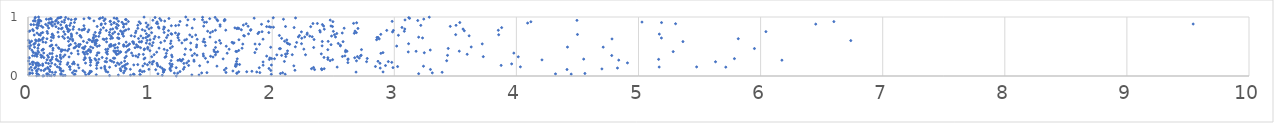
| Category | Series 0 |
|---|---|
| 1.2144086668177836 | 0.001 |
| 0.1215300041497678 | 0.002 |
| 0.12955757611474752 | 0.003 |
| 0.19000727329808487 | 0.004 |
| 0.07145748540343361 | 0.005 |
| 0.1579081799175141 | 0.006 |
| 0.6678965822670203 | 0.007 |
| 0.2871077097609726 | 0.008 |
| 0.17578260060396983 | 0.009 |
| 0.3039889196183683 | 0.01 |
| 1.0997724531098432 | 0.011 |
| 0.2172816240732766 | 0.012 |
| 0.08914720094963424 | 0.013 |
| 0.8394916528208337 | 0.014 |
| 0.7400073868209617 | 0.015 |
| 0.2700880385350502 | 0.016 |
| 1.4009557641455972 | 0.017 |
| 1.3420253837323608 | 0.018 |
| 0.2131027356835072 | 0.019 |
| 0.4727300178710579 | 0.02 |
| 0.5589203119184708 | 0.021 |
| 0.9182514465933596 | 0.022 |
| 0.9173829771784738 | 0.023 |
| 0.3783020428276976 | 0.024 |
| 0.006582157147248693 | 0.025 |
| 0.8694955682985528 | 0.026 |
| 0.08311725168608046 | 0.027 |
| 1.9923875163374185 | 0.028 |
| 0.38530420808940485 | 0.029 |
| 2.106270677933093 | 0.03 |
| 0.8631512541378085 | 0.031 |
| 4.448689318873641 | 0.032 |
| 0.2683881322957727 | 0.033 |
| 0.4965533929733858 | 0.034 |
| 0.15289310293732578 | 0.035 |
| 4.320217744781805 | 0.036 |
| 1.0644931972456235 | 0.037 |
| 0.16207567996610178 | 0.038 |
| 3.19948202993674 | 0.039 |
| 0.27131415560574257 | 0.04 |
| 0.5006649902616074 | 0.041 |
| 2.0673683422281606 | 0.042 |
| 4.561079656690674 | 0.043 |
| 0.07071758758026787 | 0.044 |
| 1.7103522935977045 | 0.045 |
| 0.036442361399267924 | 0.046 |
| 0.018837157007175944 | 0.047 |
| 1.2259524655924003 | 0.048 |
| 1.1991188298199753 | 0.049 |
| 0.012418604002464986 | 0.05 |
| 1.7111607878410697 | 0.051 |
| 1.4223431337241144 | 0.052 |
| 3.311218198336461 | 0.053 |
| 0.7835970894076577 | 0.054 |
| 2.085635196448815 | 0.055 |
| 0.3639291443448661 | 0.056 |
| 1.4655034058711052 | 0.057 |
| 1.8988076638125584 | 0.058 |
| 0.5078086952419605 | 0.059 |
| 1.6216380557405767 | 0.06 |
| 0.4649541261538967 | 0.061 |
| 0.1982417220418609 | 0.062 |
| 3.391782145928223 | 0.063 |
| 0.22514601895393827 | 0.064 |
| 1.1081358974440902 | 0.065 |
| 2.6867241456183755 | 0.066 |
| 0.6541045022682592 | 0.067 |
| 1.8732823697487258 | 0.068 |
| 2.9079057040280025 | 0.069 |
| 1.111623450094454 | 0.07 |
| 1.7261810118645886 | 0.071 |
| 1.791318408692677 | 0.072 |
| 0.9353328085813791 | 0.073 |
| 0.17875863127109448 | 0.074 |
| 1.2448728035505552 | 0.075 |
| 0.5191778176589177 | 0.076 |
| 0.6394770988743578 | 0.077 |
| 0.07226305370325031 | 0.078 |
| 0.9515829772705153 | 0.079 |
| 1.833672253506861 | 0.08 |
| 0.5084172538607648 | 0.081 |
| 0.275686499791003 | 0.082 |
| 0.9145702816420138 | 0.083 |
| 0.39341412404758364 | 0.084 |
| 1.6781800119325332 | 0.085 |
| 0.28782921509224635 | 0.086 |
| 0.7911784298665794 | 0.087 |
| 0.7622995206514396 | 0.088 |
| 0.3789319596568683 | 0.089 |
| 0.45016307857770665 | 0.09 |
| 1.1690072857432736 | 0.091 |
| 1.1115639273219442 | 0.092 |
| 0.12999585442582215 | 0.093 |
| 1.9884748128243175 | 0.094 |
| 0.0700559003311699 | 0.095 |
| 0.10710932790038309 | 0.096 |
| 2.18615909619044 | 0.097 |
| 0.03326343134686315 | 0.098 |
| 0.9192483076067398 | 0.099 |
| 0.7583555995007498 | 0.1 |
| 0.263540297405617 | 0.101 |
| 1.6086274660658695 | 0.102 |
| 0.17698413883345204 | 0.103 |
| 1.1083107982532392 | 0.104 |
| 1.1188556574672994 | 0.105 |
| 2.4064993482573174 | 0.106 |
| 1.045927321486998 | 0.107 |
| 0.6332404251820493 | 0.108 |
| 2.3470736832681944 | 0.109 |
| 4.4145998211966075 | 0.11 |
| 3.2958768766967905 | 0.111 |
| 0.3453876470151424 | 0.112 |
| 0.9902887497298358 | 0.113 |
| 0.8383820959083129 | 0.114 |
| 1.2727948317650122 | 0.115 |
| 1.1629899139518483 | 0.116 |
| 0.00953074659841387 | 0.117 |
| 0.14261472911180018 | 0.118 |
| 0.08561324006316554 | 0.119 |
| 4.700366324342087 | 0.12 |
| 0.8044542824833835 | 0.121 |
| 2.404076960961303 | 0.122 |
| 2.425557911281991 | 0.123 |
| 2.321882044393292 | 0.124 |
| 0.7556920557239851 | 0.125 |
| 0.2670155685261537 | 0.126 |
| 1.9736601300114331 | 0.127 |
| 0.5620886068641742 | 0.128 |
| 0.16442970437099125 | 0.129 |
| 1.099171593054495 | 0.13 |
| 1.622666103192687 | 0.131 |
| 1.163466704324606 | 0.132 |
| 0.05498939959314227 | 0.133 |
| 2.884679531361081 | 0.134 |
| 4.827661643652686 | 0.135 |
| 0.6290112847753035 | 0.136 |
| 0.5987214671053293 | 0.137 |
| 0.41684239468459044 | 0.138 |
| 0.7951683061617838 | 0.139 |
| 1.8941322347570113 | 0.14 |
| 1.2136754111500772 | 0.141 |
| 2.9892559231798543 | 0.142 |
| 0.256668957467506 | 0.143 |
| 0.16085704733452474 | 0.144 |
| 2.3385028590570203 | 0.145 |
| 0.024524616073971755 | 0.146 |
| 1.2805935272024311 | 0.147 |
| 0.06317259403558988 | 0.148 |
| 0.6683096761531312 | 0.149 |
| 5.714982116902153 | 0.15 |
| 2.532072855553639 | 0.151 |
| 5.169354429322742 | 0.152 |
| 1.0832553760394557 | 0.153 |
| 5.476053060237916 | 0.154 |
| 4.032758816817177 | 0.155 |
| 0.33870485329239897 | 0.156 |
| 0.23974740104684847 | 0.157 |
| 0.34430031228826913 | 0.158 |
| 0.772085139470102 | 0.159 |
| 3.0269717343543747 | 0.16 |
| 2.845438578050024 | 0.161 |
| 1.177549545748337 | 0.162 |
| 1.7025082750937164 | 0.163 |
| 0.6283721898968205 | 0.164 |
| 0.18329485083687952 | 0.165 |
| 3.2389846195014504 | 0.166 |
| 1.5474855030833337 | 0.167 |
| 1.6981412365782693 | 0.168 |
| 1.0632274280256655 | 0.169 |
| 0.940816516145423 | 0.17 |
| 1.1706373249566528 | 0.171 |
| 2.1771765790931386 | 0.172 |
| 0.7871203725035805 | 0.173 |
| 1.405815005583368 | 0.174 |
| 0.7193546902782048 | 0.175 |
| 0.08406785991897182 | 0.176 |
| 2.9278704631754104 | 0.177 |
| 0.12007589027417671 | 0.178 |
| 1.3154579294798603 | 0.179 |
| 3.8750276403906248 | 0.18 |
| 0.5623680091954087 | 0.181 |
| 0.5113092561064246 | 0.182 |
| 1.925659709840292 | 0.183 |
| 0.09604633516506478 | 0.184 |
| 0.06981567512083005 | 0.185 |
| 1.993424649986978 | 0.186 |
| 0.4089103243581985 | 0.187 |
| 0.8662845840345009 | 0.188 |
| 1.059758596746602 | 0.189 |
| 0.978612125788084 | 0.19 |
| 0.03855214239562694 | 0.191 |
| 0.7990958561912832 | 0.192 |
| 0.8990297876856288 | 0.193 |
| 0.22255795325921326 | 0.194 |
| 1.7329479270251187 | 0.195 |
| 0.32172261154707815 | 0.196 |
| 0.7468452436221209 | 0.197 |
| 1.7133014876366328 | 0.198 |
| 1.181043078688823 | 0.199 |
| 1.701714797744477 | 0.2 |
| 0.2625010918113093 | 0.201 |
| 1.0174362795477885 | 0.202 |
| 0.12014955565508309 | 0.203 |
| 0.014414819922097796 | 0.204 |
| 3.960983443968994 | 0.205 |
| 0.3645912210511699 | 0.206 |
| 0.3794649746276985 | 0.207 |
| 0.8140643361672617 | 0.208 |
| 0.9564803995310546 | 0.209 |
| 1.1619105715677869 | 0.21 |
| 0.06310473902726861 | 0.211 |
| 0.1683612983943781 | 0.212 |
| 1.276441825274528 | 0.213 |
| 0.08475607923453457 | 0.214 |
| 2.882836006502404 | 0.215 |
| 1.0560193336617936 | 0.216 |
| 0.5650657943237222 | 0.217 |
| 0.19385165117809458 | 0.218 |
| 0.4712647294288405 | 0.219 |
| 0.7330403458825818 | 0.22 |
| 1.299764574469241 | 0.221 |
| 4.909582487966346 | 0.222 |
| 0.0743538105339895 | 0.223 |
| 0.3268972640159609 | 0.224 |
| 0.14801137684104973 | 0.225 |
| 0.763924199655252 | 0.226 |
| 2.619921661947994 | 0.227 |
| 0.03436720885572423 | 0.228 |
| 0.5735472320863995 | 0.229 |
| 0.9955432798756253 | 0.23 |
| 2.9791977332973434 | 0.231 |
| 0.045210557642682565 | 0.232 |
| 0.512599625702839 | 0.233 |
| 0.7027954061152505 | 0.234 |
| 0.03786638561265594 | 0.235 |
| 0.37459857079589015 | 0.236 |
| 1.472308545462176 | 0.237 |
| 1.9254425070657755 | 0.238 |
| 1.0201777620017605 | 0.239 |
| 0.6435827377274184 | 0.24 |
| 5.630816644070149 | 0.241 |
| 0.2665635830499589 | 0.242 |
| 2.7729632537119597 | 0.243 |
| 2.9510421792823607 | 0.244 |
| 0.6318816784771856 | 0.245 |
| 1.7079125578836092 | 0.246 |
| 2.099942120600232 | 0.247 |
| 1.0293207778286724 | 0.248 |
| 2.8666195750080252 | 0.249 |
| 1.3601734545569313 | 0.25 |
| 0.6853419001252932 | 0.251 |
| 0.7913967548888403 | 0.252 |
| 1.3152899265800035 | 0.253 |
| 0.0037035727194608737 | 0.254 |
| 0.24844669395505425 | 0.255 |
| 1.2543624664286686 | 0.256 |
| 2.6902449066783367 | 0.257 |
| 1.2571445150204585 | 0.258 |
| 3.4289475507481417 | 0.259 |
| 2.47479531387841 | 0.26 |
| 1.17163911623469 | 0.261 |
| 0.18369151517990945 | 0.262 |
| 0.18346073529811346 | 0.263 |
| 0.6735107040974481 | 0.264 |
| 1.228316759136871 | 0.265 |
| 0.5161764808138952 | 0.266 |
| 0.5571880633578512 | 0.267 |
| 6.174623689722951 | 0.268 |
| 4.838124578990608 | 0.269 |
| 1.3588804246597852 | 0.27 |
| 0.5105510489168373 | 0.271 |
| 1.2430965223477226 | 0.272 |
| 4.209459235022963 | 0.273 |
| 0.23462062775293158 | 0.274 |
| 0.4585685651109266 | 0.275 |
| 0.15579934313771118 | 0.276 |
| 2.4947101764725113 | 0.277 |
| 1.2432974032861595 | 0.278 |
| 2.6196869374354748 | 0.279 |
| 1.976722433156309 | 0.28 |
| 2.455916632177413 | 0.281 |
| 5.164794351426727 | 0.282 |
| 1.2680992627777723 | 0.283 |
| 0.5806851298246852 | 0.284 |
| 0.23190480774361427 | 0.285 |
| 4.5510528003451345 | 0.286 |
| 0.19593711083526316 | 0.287 |
| 0.9496118843616222 | 0.288 |
| 2.621699753805331 | 0.289 |
| 1.598201856849552 | 0.29 |
| 1.7139719296732154 | 0.291 |
| 0.5484592151065364 | 0.292 |
| 2.018942908008908 | 0.293 |
| 5.785760829999882 | 0.294 |
| 1.9954629027846142 | 0.295 |
| 0.2704840934390322 | 0.296 |
| 2.7782464864701364 | 0.297 |
| 0.6439527417658998 | 0.298 |
| 0.4685625535664691 | 0.299 |
| 1.453178902978486 | 0.3 |
| 0.7101397442114963 | 0.301 |
| 0.6995394337925538 | 0.302 |
| 2.7125562666369505 | 0.303 |
| 0.010003028348418833 | 0.304 |
| 0.9581238310022255 | 0.305 |
| 1.9809235161663068 | 0.306 |
| 0.5059278934539263 | 0.307 |
| 0.7935164315796833 | 0.308 |
| 2.6756133336850443 | 0.309 |
| 2.4558712106466496 | 0.31 |
| 0.008478656930965797 | 0.311 |
| 0.13004204285169615 | 0.312 |
| 0.466498808816066 | 0.313 |
| 0.6075139973434858 | 0.314 |
| 2.424301195984709 | 0.315 |
| 1.12170683443943 | 0.316 |
| 0.10890656040562695 | 0.317 |
| 0.1681880992711305 | 0.318 |
| 0.26501537806043973 | 0.319 |
| 0.20000606577806088 | 0.32 |
| 0.900228087181413 | 0.321 |
| 1.5154665288372773 | 0.322 |
| 0.3365405631894606 | 0.323 |
| 1.1804428412528887 | 0.324 |
| 4.015235943493407 | 0.325 |
| 1.0133209519941768 | 0.326 |
| 0.28965551303354475 | 0.327 |
| 3.7288309465958216 | 0.328 |
| 2.6977724388403717 | 0.329 |
| 2.1114551406531477 | 0.33 |
| 2.5750634680029716 | 0.331 |
| 1.1301499814165066 | 0.332 |
| 0.07293413086293342 | 0.333 |
| 1.4954081151741538 | 0.334 |
| 0.8051665110814061 | 0.335 |
| 0.23505260295395244 | 0.336 |
| 1.9546082636266056 | 0.337 |
| 0.1172548475499714 | 0.338 |
| 1.4371097741236432 | 0.339 |
| 0.8832537460205515 | 0.34 |
| 2.595505940700128 | 0.341 |
| 2.7233666982564406 | 0.342 |
| 0.05447247849822645 | 0.343 |
| 0.03756483919488693 | 0.344 |
| 0.8590375536425104 | 0.345 |
| 1.3446228856910931 | 0.346 |
| 4.7807105248076605 | 0.347 |
| 0.16029547571507446 | 0.348 |
| 2.0770673534907185 | 0.349 |
| 3.435909516403385 | 0.35 |
| 0.5629167574398649 | 0.351 |
| 2.7288306321563205 | 0.352 |
| 1.3840425627249204 | 0.353 |
| 1.1764420137156695 | 0.354 |
| 0.10408716718324941 | 0.355 |
| 0.26493179114915133 | 0.356 |
| 0.30251797585410806 | 0.357 |
| 2.0377947381778414 | 0.358 |
| 1.5352142853422923 | 0.359 |
| 2.2729374263940327 | 0.36 |
| 2.1642455943471726 | 0.361 |
| 1.032999345772811 | 0.362 |
| 0.7268838220414809 | 0.363 |
| 1.2832595663942676 | 0.364 |
| 0.9089562525003161 | 0.365 |
| 0.46530655155491046 | 0.366 |
| 0.9445976034983111 | 0.367 |
| 3.5968442189187826 | 0.368 |
| 0.07655600858272549 | 0.369 |
| 0.06721683321602871 | 0.37 |
| 2.108968996736179 | 0.371 |
| 0.6503869243321991 | 0.372 |
| 0.41134250928176164 | 0.373 |
| 1.435243647208343 | 0.374 |
| 2.4020297839810096 | 0.375 |
| 0.4868428551410285 | 0.376 |
| 0.7247750801707881 | 0.377 |
| 0.7410306452186052 | 0.378 |
| 1.3638709186187286 | 0.379 |
| 0.17942891048942144 | 0.38 |
| 0.19764078753355746 | 0.381 |
| 2.123544055411317 | 0.382 |
| 1.1327790330357383 | 0.383 |
| 2.8900698078016434 | 0.384 |
| 0.3551129743479803 | 0.385 |
| 1.6312280355218902 | 0.386 |
| 0.06369577532228614 | 0.387 |
| 3.9791167802034764 | 0.388 |
| 0.8483866164095889 | 0.389 |
| 0.12895488475870498 | 0.39 |
| 0.5699139440606901 | 0.391 |
| 0.45808242886484446 | 0.392 |
| 0.5809142443769554 | 0.393 |
| 3.245780952231504 | 0.394 |
| 0.045475678886254915 | 0.395 |
| 2.9072246105028148 | 0.396 |
| 1.8581376786821695 | 0.397 |
| 0.6410406247242947 | 0.398 |
| 1.5388012342294677 | 0.399 |
| 0.08783318463266004 | 0.4 |
| 0.7136296656192564 | 0.401 |
| 0.8026703727276432 | 0.402 |
| 0.755790994892924 | 0.403 |
| 1.0540753375954954 | 0.404 |
| 0.4515294536166193 | 0.405 |
| 0.041397626719527465 | 0.406 |
| 0.5117627401882094 | 0.407 |
| 3.1142701651600784 | 0.408 |
| 0.4758153937899154 | 0.409 |
| 0.7590667039904571 | 0.41 |
| 2.6006304174736914 | 0.411 |
| 1.5535268803563154 | 0.412 |
| 5.284117528996314 | 0.413 |
| 1.70989186239571 | 0.414 |
| 1.525889658027383 | 0.415 |
| 0.6498908716464605 | 0.416 |
| 0.272172316187524 | 0.417 |
| 1.7026140481994407 | 0.418 |
| 3.1786082049419626 | 0.419 |
| 2.612730471046257 | 0.42 |
| 3.5321576148751155 | 0.421 |
| 0.7201165400224165 | 0.422 |
| 0.08095922785995896 | 0.423 |
| 0.4082796741672364 | 0.424 |
| 0.7028058358415146 | 0.425 |
| 2.1255413363213873 | 0.426 |
| 0.7377172873414197 | 0.427 |
| 0.32397613257290486 | 0.428 |
| 0.49175554870373434 | 0.429 |
| 0.9984195517671426 | 0.43 |
| 0.5132000749779955 | 0.431 |
| 0.8171708878123009 | 0.432 |
| 1.7256527677427265 | 0.433 |
| 1.1403460379357933 | 0.434 |
| 2.601524316296903 | 0.435 |
| 0.11452453630241753 | 0.436 |
| 0.03195954834145208 | 0.437 |
| 0.20381354403595633 | 0.438 |
| 0.30371384063853796 | 0.439 |
| 3.2945174403650723 | 0.44 |
| 0.28458485229402153 | 0.441 |
| 1.52259641887685 | 0.442 |
| 0.27315957901318166 | 0.443 |
| 1.3325108369778276 | 0.444 |
| 0.9515883835648195 | 0.445 |
| 2.455492093026471 | 0.446 |
| 2.731264316518274 | 0.447 |
| 0.4991929868100742 | 0.448 |
| 0.8281718067770729 | 0.449 |
| 0.6365664820145431 | 0.45 |
| 0.1222296152056328 | 0.451 |
| 0.12602680058503402 | 0.452 |
| 1.115135231518835 | 0.453 |
| 1.6474613540237288 | 0.454 |
| 2.259146701643925 | 0.455 |
| 1.8706065439919954 | 0.456 |
| 0.33522055341513685 | 0.457 |
| 0.6546231806338607 | 0.458 |
| 1.2897226280011587 | 0.459 |
| 0.9540036386791859 | 0.46 |
| 0.9801828100285145 | 0.461 |
| 0.4592929991354948 | 0.462 |
| 2.0592829352645294 | 0.463 |
| 2.0673218664359427 | 0.464 |
| 5.949459672869836 | 0.465 |
| 0.2548248545127168 | 0.466 |
| 3.4416258933617625 | 0.467 |
| 0.014475165464608449 | 0.468 |
| 0.08178506048675574 | 0.469 |
| 0.2050034605905965 | 0.47 |
| 1.7532781421285129 | 0.471 |
| 1.07366097016658 | 0.472 |
| 1.1660646023660548 | 0.473 |
| 0.3767256782516952 | 0.474 |
| 0.712300655247056 | 0.475 |
| 0.44660445058641124 | 0.476 |
| 0.5309918179269145 | 0.477 |
| 0.4555493772488923 | 0.478 |
| 0.9216746581298391 | 0.479 |
| 0.8768575304962707 | 0.48 |
| 0.2482308442613794 | 0.481 |
| 0.7334311909418764 | 0.482 |
| 2.339557318140506 | 0.483 |
| 1.5356967767313097 | 0.484 |
| 0.3860829731606372 | 0.485 |
| 0.9803711453419276 | 0.486 |
| 1.98745916309427 | 0.487 |
| 0.05356973347295536 | 0.488 |
| 4.710806058074795 | 0.489 |
| 4.418313784568203 | 0.49 |
| 1.3798995639929807 | 0.491 |
| 3.6298125130679835 | 0.492 |
| 0.5129685291280872 | 0.493 |
| 0.8951197283275045 | 0.494 |
| 2.189564570981082 | 0.495 |
| 0.41760611924233115 | 0.496 |
| 0.6699927743092529 | 0.497 |
| 1.1826925293829593 | 0.498 |
| 0.9036364402011302 | 0.499 |
| 0.4683249587055913 | 0.5 |
| 0.0039178397142495 | 0.501 |
| 0.5667775159166896 | 0.502 |
| 0.8063840804234985 | 0.503 |
| 0.7844980001204522 | 0.504 |
| 1.6236178933989305 | 0.505 |
| 0.1808701970351314 | 0.506 |
| 3.0195449877864187 | 0.507 |
| 0.3976195077114462 | 0.508 |
| 0.6830543365419403 | 0.509 |
| 2.558430439769287 | 0.51 |
| 2.4088035310345055 | 0.511 |
| 0.1878937368980898 | 0.512 |
| 0.3356699907914724 | 0.513 |
| 0.5840736584150662 | 0.514 |
| 1.4529052308570733 | 0.515 |
| 1.0166057163604636 | 0.516 |
| 0.7019251211390012 | 0.517 |
| 0.022006755875530238 | 0.518 |
| 0.08559235664211284 | 0.519 |
| 0.8199938428598982 | 0.52 |
| 0.6685466650304969 | 0.521 |
| 2.5585579613055325 | 0.522 |
| 0.23116235008207558 | 0.523 |
| 0.7846171062015229 | 0.524 |
| 0.19576918680456848 | 0.525 |
| 1.3816011086939144 | 0.526 |
| 0.7834014999848634 | 0.527 |
| 0.5501600971881404 | 0.528 |
| 0.8882964856452615 | 0.529 |
| 0.7139885844936203 | 0.53 |
| 2.4820671130135397 | 0.531 |
| 0.0892194532306527 | 0.532 |
| 0.4155013421777372 | 0.533 |
| 0.34859132976199286 | 0.534 |
| 0.427502454453328 | 0.535 |
| 0.6789812334470564 | 0.536 |
| 2.143004240702837 | 0.537 |
| 1.8961737972857189 | 0.538 |
| 0.047759660218581614 | 0.539 |
| 0.049911072285701547 | 0.54 |
| 1.7593717915202847 | 0.541 |
| 1.8595472472401933 | 0.542 |
| 0.8313911499571931 | 0.543 |
| 3.7202510745080994 | 0.544 |
| 0.9960463262706293 | 0.545 |
| 2.130070482895544 | 0.546 |
| 3.1171514904778785 | 0.547 |
| 2.240037896859853 | 0.548 |
| 0.8656917896291195 | 0.549 |
| 1.1675235817655005 | 0.55 |
| 0.7451093523239072 | 0.551 |
| 2.5409287786029333 | 0.552 |
| 0.5573791333128929 | 0.553 |
| 0.38683312458144675 | 0.554 |
| 1.680424338355185 | 0.555 |
| 1.5781958073030993 | 0.556 |
| 0.058898253068717904 | 0.557 |
| 1.3325722953569992 | 0.558 |
| 0.9682918976128669 | 0.559 |
| 1.2603657309839489 | 0.56 |
| 0.011899699576260395 | 0.561 |
| 1.6870016685859526 | 0.562 |
| 2.1208863736997685 | 0.563 |
| 0.5469357882657495 | 0.564 |
| 0.4838629645863055 | 0.565 |
| 1.0246591640022924 | 0.566 |
| 1.0874040166157928 | 0.567 |
| 2.20014801941295 | 0.568 |
| 0.14589473486794566 | 0.569 |
| 0.016410021743221988 | 0.57 |
| 1.6713117234885024 | 0.571 |
| 1.5374423283460132 | 0.572 |
| 1.4482132891897672 | 0.573 |
| 0.8037396642590983 | 0.574 |
| 0.8636056549500681 | 0.575 |
| 0.12275645403033227 | 0.576 |
| 0.9277096353992362 | 0.577 |
| 0.6435578792436958 | 0.578 |
| 0.9116871683654304 | 0.579 |
| 0.8567342884697023 | 0.58 |
| 0.5254681108529466 | 0.581 |
| 2.5802492707332885 | 0.582 |
| 5.3640445930416565 | 0.583 |
| 1.434352119713144 | 0.584 |
| 2.410128680425395 | 0.585 |
| 0.9303775910641271 | 0.586 |
| 2.458467845667814 | 0.587 |
| 0.4539161473491719 | 0.588 |
| 0.33167245145945823 | 0.589 |
| 2.101344077608012 | 0.59 |
| 0.029131030199493552 | 0.591 |
| 0.06640226231902557 | 0.592 |
| 1.1715870309093261 | 0.593 |
| 0.5569444548865257 | 0.594 |
| 1.119170604628083 | 0.595 |
| 0.08571887638918232 | 0.596 |
| 0.5253846221166533 | 0.597 |
| 0.36630722299322327 | 0.598 |
| 0.18902161702139963 | 0.599 |
| 6.7387108639583815 | 0.6 |
| 0.5400970095205768 | 0.601 |
| 1.5684905774860316 | 0.602 |
| 0.9759691239912408 | 0.603 |
| 0.003976063292822785 | 0.604 |
| 0.5670212990870018 | 0.605 |
| 0.09880683148969507 | 0.606 |
| 1.2370763903450976 | 0.607 |
| 1.2831625992990976 | 0.608 |
| 0.5587835907821181 | 0.609 |
| 0.5055465217767665 | 0.61 |
| 0.062040151364576315 | 0.611 |
| 2.1193626926339326 | 0.612 |
| 0.9995247054682077 | 0.613 |
| 1.7275920288396756 | 0.614 |
| 2.8551864144329384 | 0.615 |
| 0.4984419609219178 | 0.616 |
| 0.6254906054191376 | 0.617 |
| 2.3427704296941285 | 0.618 |
| 0.08990913299211752 | 0.619 |
| 0.11635350492400959 | 0.62 |
| 1.2986398844972509 | 0.621 |
| 1.3857331736356515 | 0.622 |
| 0.3650245106782263 | 0.623 |
| 1.9249082087234128 | 0.624 |
| 1.441357943662795 | 0.625 |
| 0.6150723778359624 | 0.626 |
| 0.3463257691414831 | 0.627 |
| 4.783013336620924 | 0.628 |
| 2.8765769104086285 | 0.629 |
| 1.0318027814865458 | 0.63 |
| 0.15531625236732063 | 0.631 |
| 5.817145785645564 | 0.632 |
| 0.6429905165183519 | 0.633 |
| 0.6767556021765504 | 0.634 |
| 0.9050664518779596 | 0.635 |
| 0.7455064110150573 | 0.636 |
| 0.2977337784069244 | 0.637 |
| 2.0770246090205915 | 0.638 |
| 0.5354734958217539 | 0.639 |
| 2.242051572825048 | 0.64 |
| 0.7419993540925897 | 0.641 |
| 0.9423642024234957 | 0.642 |
| 0.6921057442467602 | 0.643 |
| 5.187575451501196 | 0.644 |
| 3.2314192824659163 | 0.645 |
| 0.7339984336103502 | 0.646 |
| 0.12490979509248772 | 0.647 |
| 0.2075580200407648 | 0.648 |
| 1.2288331207399998 | 0.649 |
| 0.9649023384122182 | 0.65 |
| 1.1348361389255013 | 0.651 |
| 0.327803822500172 | 0.652 |
| 2.8580096986167636 | 0.653 |
| 2.866965835732398 | 0.654 |
| 0.5365495175644567 | 0.655 |
| 1.0719902443215723 | 0.656 |
| 0.4355574380208716 | 0.657 |
| 3.1995556501628344 | 0.658 |
| 0.19190691233071921 | 0.659 |
| 1.4909509094316988 | 0.66 |
| 2.5186805279806213 | 0.661 |
| 2.266257354051991 | 0.662 |
| 2.2143790726745793 | 0.663 |
| 1.3435372249936062 | 0.664 |
| 2.327590908164059 | 0.665 |
| 0.25198827713580824 | 0.666 |
| 0.3566555077303447 | 0.667 |
| 0.28421861286140837 | 0.668 |
| 1.0407889046374201 | 0.669 |
| 0.9806742855946036 | 0.67 |
| 0.8731293253772532 | 0.671 |
| 0.5797300443848742 | 0.672 |
| 0.5554789006909585 | 0.673 |
| 0.6817282202631039 | 0.674 |
| 0.7823061106105635 | 0.675 |
| 2.307466862095032 | 0.676 |
| 2.486099822163454 | 0.677 |
| 0.9242579375484214 | 0.678 |
| 1.7722503252899424 | 0.679 |
| 0.20864230933465178 | 0.68 |
| 3.6128978210056837 | 0.681 |
| 0.845197005658723 | 0.682 |
| 0.42574448663285497 | 0.683 |
| 0.42661752400830877 | 0.684 |
| 1.766094641422983 | 0.685 |
| 2.2227403502534564 | 0.686 |
| 2.0587577128059906 | 0.687 |
| 0.9906601135688196 | 0.688 |
| 1.2266948660277337 | 0.689 |
| 3.033507138554681 | 0.69 |
| 1.1453023989451017 | 0.691 |
| 0.10009850758444137 | 0.692 |
| 0.3567107802980914 | 0.693 |
| 1.3735716758734964 | 0.694 |
| 0.05102050426002272 | 0.695 |
| 1.3249156203276813 | 0.696 |
| 0.5396061110068443 | 0.697 |
| 0.6670214174474244 | 0.698 |
| 3.8549449181808275 | 0.699 |
| 2.5101214255314073 | 0.7 |
| 3.502678944615633 | 0.701 |
| 0.08886495485939161 | 0.702 |
| 0.19841712605735218 | 0.703 |
| 4.500106087987897 | 0.704 |
| 2.285332122596706 | 0.705 |
| 2.889471559058561 | 0.706 |
| 0.3029251866131122 | 0.707 |
| 1.177247407338943 | 0.708 |
| 0.7725276685270285 | 0.709 |
| 5.170486962833346 | 0.71 |
| 0.1989731995876582 | 0.711 |
| 0.7408075618878659 | 0.712 |
| 0.3539569174494506 | 0.713 |
| 1.8061177939305413 | 0.714 |
| 1.2350663557802515 | 0.715 |
| 0.969802718544799 | 0.716 |
| 1.172019332088936 | 0.717 |
| 0.6940303502429765 | 0.718 |
| 1.8831088101050415 | 0.719 |
| 2.5290011581290566 | 0.72 |
| 0.7761071921795748 | 0.721 |
| 0.16084469972425422 | 0.722 |
| 0.5869749216557493 | 0.723 |
| 2.6724553690500894 | 0.724 |
| 0.10768095934729507 | 0.725 |
| 0.40016921514317777 | 0.726 |
| 2.2871195626484235 | 0.727 |
| 0.07392727722248273 | 0.728 |
| 2.573649780836713 | 0.729 |
| 1.207605773509331 | 0.73 |
| 0.8805475293310814 | 0.731 |
| 0.5881950415233724 | 0.732 |
| 1.4933453087748862 | 0.733 |
| 1.0124376588120998 | 0.734 |
| 2.6892504752974977 | 0.735 |
| 1.9723083623186415 | 0.736 |
| 0.12019687967699287 | 0.737 |
| 1.1151318939430859 | 0.738 |
| 0.5507620536244282 | 0.739 |
| 0.6676727108922623 | 0.74 |
| 1.8916630504340604 | 0.741 |
| 0.24518709528681118 | 0.742 |
| 0.589740348765428 | 0.743 |
| 0.7096742615939162 | 0.744 |
| 0.7717288897026873 | 0.745 |
| 2.3932370380688175 | 0.746 |
| 2.9855121561950373 | 0.747 |
| 2.2393263054294112 | 0.748 |
| 0.4904798352712024 | 0.749 |
| 0.29295237989927997 | 0.75 |
| 1.9169998865191775 | 0.751 |
| 6.043604029754857 | 0.752 |
| 0.33059544423585535 | 0.753 |
| 0.15636015009659351 | 0.754 |
| 1.5125588227102116 | 0.755 |
| 0.008212333572278938 | 0.756 |
| 2.5009652465134513 | 0.757 |
| 3.082108000662938 | 0.758 |
| 1.4712886499645421 | 0.759 |
| 0.3276610705074956 | 0.76 |
| 2.678202800457637 | 0.761 |
| 0.8848870991842562 | 0.762 |
| 0.758280540749823 | 0.763 |
| 0.7886918176479968 | 0.764 |
| 0.016467371186734123 | 0.765 |
| 0.9578170356990404 | 0.766 |
| 3.573433172930647 | 0.767 |
| 0.043769513783312675 | 0.768 |
| 1.1506795227240652 | 0.769 |
| 2.389894067014001 | 0.77 |
| 0.641488712598341 | 0.771 |
| 2.9926398680783444 | 0.772 |
| 2.938081663666908 | 0.773 |
| 1.8223580049086914 | 0.774 |
| 3.8518729720828695 | 0.775 |
| 1.534954516630072 | 0.776 |
| 1.6196188208275326 | 0.777 |
| 0.4405404144540882 | 0.778 |
| 0.3408150838161654 | 0.779 |
| 0.8017601867489222 | 0.78 |
| 0.49859462074754085 | 0.781 |
| 0.44789438552732597 | 0.782 |
| 1.7475415099219311 | 0.783 |
| 0.5955090359099872 | 0.784 |
| 0.9360699209816459 | 0.785 |
| 1.825583465838851 | 0.786 |
| 0.45991225696240123 | 0.787 |
| 0.038201052454462314 | 0.788 |
| 0.6760922127458849 | 0.789 |
| 0.41880447364864754 | 0.79 |
| 0.36890828861993913 | 0.791 |
| 1.1096099699809892 | 0.792 |
| 2.426768760066261 | 0.793 |
| 0.32582620234390985 | 0.794 |
| 0.8240657780810202 | 0.795 |
| 3.5629423407677274 | 0.796 |
| 3.0859249868905763 | 0.797 |
| 0.6944488431688501 | 0.798 |
| 0.9907946793162221 | 0.799 |
| 0.27349274286177216 | 0.8 |
| 0.32352132569924197 | 0.801 |
| 1.710875880119567 | 0.802 |
| 0.4627719011118626 | 0.803 |
| 1.7274814155587543 | 0.804 |
| 0.2510956118048832 | 0.805 |
| 2.70234057345642 | 0.806 |
| 0.7288287194797362 | 0.807 |
| 0.8995212319939444 | 0.808 |
| 0.07611537497466808 | 0.809 |
| 2.5892410997484627 | 0.81 |
| 1.073155860319334 | 0.811 |
| 1.3448649177181187 | 0.812 |
| 0.16877028217092438 | 0.813 |
| 0.2801487409766947 | 0.814 |
| 1.7190393184621193 | 0.815 |
| 1.6946621975775338 | 0.816 |
| 1.0106532491155265 | 0.817 |
| 0.6175853964762369 | 0.818 |
| 0.07212662815186202 | 0.819 |
| 3.8793272726604875 | 0.82 |
| 2.1795346579027095 | 0.821 |
| 1.1175215540577905 | 0.822 |
| 3.06293258275689 | 0.823 |
| 0.3166132025783012 | 0.824 |
| 0.12161509099530372 | 0.825 |
| 0.7218595305734256 | 0.826 |
| 2.0101597678065053 | 0.827 |
| 1.9886975772062387 | 0.828 |
| 1.068330340628734 | 0.829 |
| 0.7825149658686031 | 0.83 |
| 1.1134667038820827 | 0.831 |
| 0.9739328673483012 | 0.832 |
| 0.373619659252052 | 0.833 |
| 1.9757815774020728 | 0.834 |
| 0.22925129325965124 | 0.835 |
| 2.3152634322583046 | 0.836 |
| 1.954651598660908 | 0.837 |
| 2.4940536063841514 | 0.838 |
| 2.109193284565955 | 0.839 |
| 0.5664946491074515 | 0.84 |
| 3.458435452312745 | 0.841 |
| 0.31389124316834965 | 0.842 |
| 1.80268251802506 | 0.843 |
| 1.5735404168987568 | 0.844 |
| 1.4389394664307382 | 0.845 |
| 0.10882824964928485 | 0.846 |
| 2.4209930187553694 | 0.847 |
| 2.4815486815934964 | 0.848 |
| 0.2004201078859333 | 0.849 |
| 0.16011876650660617 | 0.85 |
| 0.08535465010208848 | 0.851 |
| 1.1740808648427488 | 0.852 |
| 0.4579283711857741 | 0.853 |
| 1.2095014807038325 | 0.854 |
| 0.3150167132567462 | 0.855 |
| 0.7397739025138785 | 0.856 |
| 0.34214582678989025 | 0.857 |
| 3.2169803520032763 | 0.858 |
| 3.5055980639248383 | 0.859 |
| 0.8994519736493314 | 0.86 |
| 1.3019120521995557 | 0.861 |
| 1.2345011116326747 | 0.862 |
| 1.763871477104156 | 0.863 |
| 0.9836754553529855 | 0.864 |
| 0.0843362283374751 | 0.865 |
| 0.5987854424847376 | 0.866 |
| 0.2684302682780112 | 0.867 |
| 1.5729608714177352 | 0.868 |
| 0.07057171480915513 | 0.869 |
| 0.046990128930144086 | 0.87 |
| 0.02449778507449886 | 0.871 |
| 2.41097944000633 | 0.872 |
| 0.7836815216065026 | 0.873 |
| 0.6820053653256206 | 0.874 |
| 0.14453583618597457 | 0.875 |
| 1.9125202454842516 | 0.876 |
| 0.18970786825785324 | 0.877 |
| 0.7265137873593831 | 0.878 |
| 6.451546515892722 | 0.879 |
| 0.21820248285451138 | 0.88 |
| 9.542642067180683 | 0.881 |
| 0.7825361902450342 | 0.882 |
| 0.6007391102359237 | 0.883 |
| 0.8042028739601764 | 0.884 |
| 1.7867172211482418 | 0.885 |
| 5.303715521252858 | 0.886 |
| 0.6329663260255676 | 0.887 |
| 1.0618977401279421 | 0.888 |
| 2.3338358850271153 | 0.889 |
| 2.3699416773993933 | 0.89 |
| 0.9207557419832793 | 0.891 |
| 2.666427396279416 | 0.892 |
| 0.08814198703344976 | 0.893 |
| 1.051771070761824 | 0.894 |
| 0.35052713639571603 | 0.895 |
| 0.24496445267286884 | 0.896 |
| 4.091843624651257 | 0.897 |
| 0.16885737071113407 | 0.898 |
| 0.9671087754252778 | 0.899 |
| 0.7030706841540104 | 0.9 |
| 0.17779575873989958 | 0.901 |
| 2.6915697811473565 | 0.902 |
| 0.08102119970129204 | 0.903 |
| 0.7066489748075745 | 0.904 |
| 5.188641158163352 | 0.905 |
| 3.5365385895835266 | 0.906 |
| 0.3806197939389479 | 0.907 |
| 0.24755597790035874 | 0.908 |
| 0.29774768136123353 | 0.909 |
| 1.4443771485846557 | 0.91 |
| 0.7699334163067145 | 0.911 |
| 1.4616755464458 | 0.912 |
| 0.19398456997745564 | 0.913 |
| 5.028513686538819 | 0.914 |
| 0.2009744152106559 | 0.915 |
| 1.0575575551101146 | 0.916 |
| 0.08674660257252069 | 0.917 |
| 0.9101433610443189 | 0.918 |
| 4.1186189740076955 | 0.919 |
| 0.2775190959837266 | 0.92 |
| 2.4971814062467645 | 0.921 |
| 6.6001799187508485 | 0.922 |
| 0.8218573577437671 | 0.923 |
| 0.6721765322915044 | 0.924 |
| 1.245147780627254 | 0.925 |
| 2.982378201803768 | 0.926 |
| 1.9686144155031975 | 0.927 |
| 0.6746219301577147 | 0.928 |
| 0.7405774046937064 | 0.929 |
| 0.2256792729163888 | 0.93 |
| 1.11984179879804 | 0.931 |
| 0.10569187433709701 | 0.932 |
| 0.059750027317101925 | 0.933 |
| 0.5400528435556876 | 0.934 |
| 0.04429169439254826 | 0.935 |
| 1.6074595305672514 | 0.936 |
| 1.5534686421511037 | 0.937 |
| 0.05433332890502997 | 0.938 |
| 0.6227961140931092 | 0.939 |
| 3.191994470548625 | 0.94 |
| 0.0953831592644704 | 0.941 |
| 1.0900958450945408 | 0.942 |
| 4.49598552474763 | 0.943 |
| 0.23205803317913337 | 0.944 |
| 1.0228181260452995 | 0.945 |
| 0.08562146061828044 | 0.946 |
| 2.4752131380894493 | 0.947 |
| 0.299483708107672 | 0.948 |
| 1.6145001158166477 | 0.949 |
| 3.087745630820212 | 0.95 |
| 1.3095045891837431 | 0.951 |
| 1.4292664455856379 | 0.952 |
| 0.09110513188445989 | 0.953 |
| 0.35425797618903926 | 0.954 |
| 0.8045349185422037 | 0.955 |
| 1.5466526218109833 | 0.956 |
| 1.6103065878860214 | 0.957 |
| 0.7987203057899017 | 0.958 |
| 0.3846006661938698 | 0.959 |
| 1.361899292991823 | 0.96 |
| 0.1712096975413673 | 0.961 |
| 2.092132820575291 | 0.962 |
| 0.15050714923686212 | 0.963 |
| 3.241321853081837 | 0.964 |
| 0.6323987645351753 | 0.965 |
| 0.191027529236381 | 0.966 |
| 0.391451962196448 | 0.967 |
| 0.33085123386744086 | 0.968 |
| 0.4581507826920029 | 0.969 |
| 0.7254762425844957 | 0.97 |
| 0.5842435302469897 | 0.971 |
| 1.4881283589157597 | 0.972 |
| 1.0790323988825838 | 0.973 |
| 0.18327001199261436 | 0.974 |
| 1.154098680274751 | 0.975 |
| 0.5058146578004844 | 0.976 |
| 3.1247763840100764 | 0.977 |
| 0.7278196548105261 | 0.978 |
| 0.2437295295870708 | 0.979 |
| 1.8523128011743444 | 0.98 |
| 0.5934145366500909 | 0.981 |
| 0.05731091631525187 | 0.982 |
| 0.7051862394826247 | 0.983 |
| 2.191399641392666 | 0.984 |
| 0.2518889839217914 | 0.985 |
| 0.49732519350848 | 0.986 |
| 2.008891951751476 | 0.987 |
| 0.2625951171092933 | 0.988 |
| 3.1183774007651897 | 0.989 |
| 0.612387782386937 | 0.99 |
| 1.0406718764372396 | 0.991 |
| 0.30843007305302594 | 0.992 |
| 1.5328054891763279 | 0.993 |
| 0.06073301735964599 | 0.994 |
| 1.4300482086081578 | 0.995 |
| 0.27018966555466856 | 0.996 |
| 3.286460169678229 | 0.997 |
| 0.950560114335503 | 0.998 |
| 0.08655074540119789 | 0.999 |
| 1.2922889301201146 | 1 |